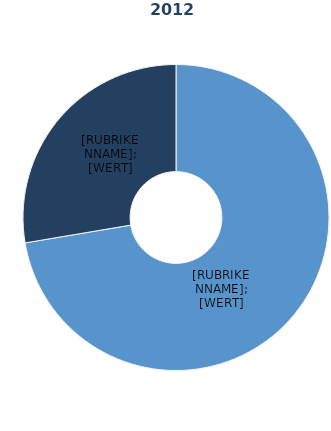
| Category | Series 1 |
|---|---|
| Vollzeitbeschäftigte | 72.2 |
| Teilzeitbeschäftigte | 27.6 |